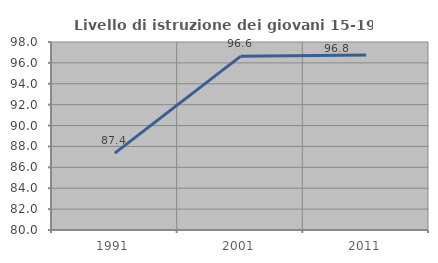
| Category | Livello di istruzione dei giovani 15-19 anni |
|---|---|
| 1991.0 | 87.363 |
| 2001.0 | 96.624 |
| 2011.0 | 96.751 |